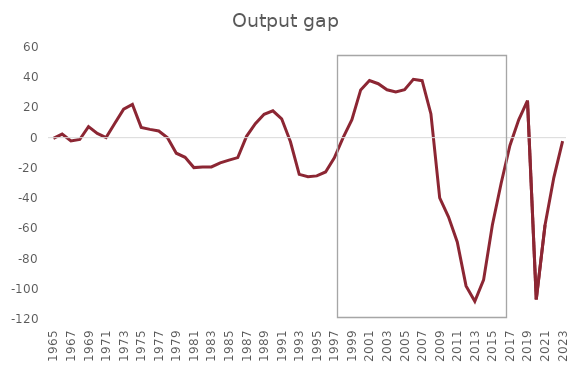
| Category | Output gap |
|---|---|
| 1965.0 | -0.5 |
| 1966.0 | 2.4 |
| 1967.0 | -2.2 |
| 1968.0 | -1.2 |
| 1969.0 | 7.3 |
| 1970.0 | 2.8 |
| 1971.0 | 0.1 |
| 1972.0 | 9.5 |
| 1973.0 | 18.9 |
| 1974.0 | 22 |
| 1975.0 | 6.8 |
| 1976.0 | 5.5 |
| 1977.0 | 4.4 |
| 1978.0 | -0.1 |
| 1979.0 | -10.3 |
| 1980.0 | -13 |
| 1981.0 | -19.8 |
| 1982.0 | -19.4 |
| 1983.0 | -19.4 |
| 1984.0 | -16.7 |
| 1985.0 | -14.9 |
| 1986.0 | -13.2 |
| 1987.0 | 0.9 |
| 1988.0 | 9.2 |
| 1989.0 | 15.5 |
| 1990.0 | 17.8 |
| 1991.0 | 12.5 |
| 1992.0 | -2.7 |
| 1993.0 | -24.3 |
| 1994.0 | -25.9 |
| 1995.0 | -25.3 |
| 1996.0 | -22.7 |
| 1997.0 | -13.4 |
| 1998.0 | 0 |
| 1999.0 | 11.9 |
| 2000.0 | 31.6 |
| 2001.0 | 37.8 |
| 2002.0 | 35.7 |
| 2003.0 | 31.7 |
| 2004.0 | 30.3 |
| 2005.0 | 31.8 |
| 2006.0 | 38.6 |
| 2007.0 | 37.7 |
| 2008.0 | 15.7 |
| 2009.0 | -39.8 |
| 2010.0 | -52.4 |
| 2011.0 | -69 |
| 2012.0 | -98.1 |
| 2013.0 | -108.3 |
| 2014.0 | -94.1 |
| 2015.0 | -57.8 |
| 2016.0 | -30.2 |
| 2017.0 | -5.2 |
| 2018.0 | 11.8 |
| 2019.0 | 24.5 |
| 2020.0 | -107 |
| 2021.0 | -57.8 |
| 2022.0 | -26.4 |
| 2023.0 | -2.3 |